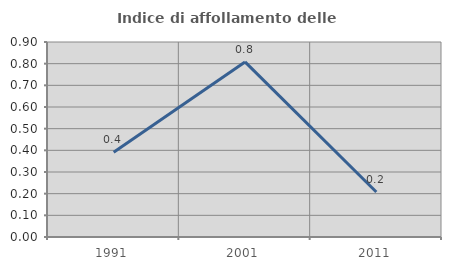
| Category | Indice di affollamento delle abitazioni  |
|---|---|
| 1991.0 | 0.391 |
| 2001.0 | 0.808 |
| 2011.0 | 0.207 |